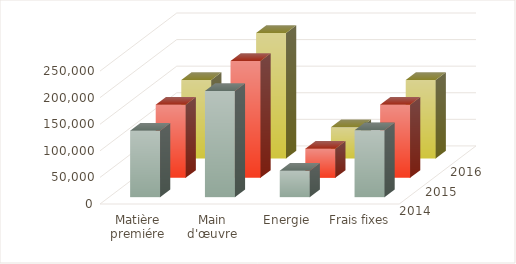
| Category | 2014 | 2015 | 2016 |
|---|---|---|---|
| Matière premiére | 125000 | 137500 | 147500 |
| Main d'œuvre | 200000 | 220000 | 236000 |
| Energie | 50000 | 55000 | 59000 |
| Frais fixes | 126000 | 137500 | 147500 |